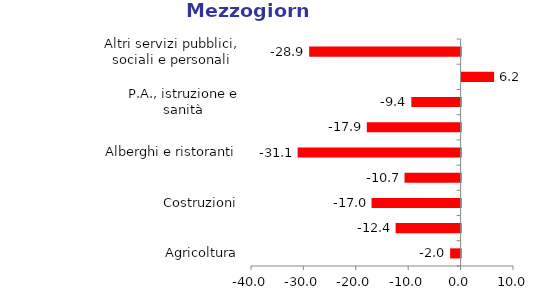
| Category | Mezzogiorno |
|---|---|
| Agricoltura | -2 |
| Industria in senso stretto | -12.4 |
| Costruzioni | -17 |
| Commercio e riparazioni | -10.7 |
| Alberghi e ristoranti | -31.1 |
| Trasporti, comunicazioni etc. | -17.9 |
| P.A., istruzione e sanità | -9.4 |
| Attività svolte da famiglie e convivenze | 6.2 |
| Altri servizi pubblici, sociali e personali | -28.9 |